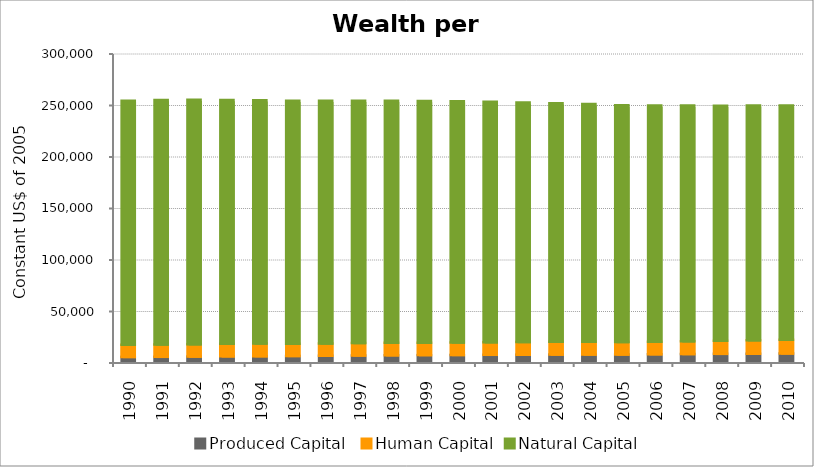
| Category | Produced Capital  | Human Capital | Natural Capital |
|---|---|---|---|
| 1990.0 | 4715 | 11854.096 | 236830.702 |
| 1991.0 | 4791.001 | 11918.609 | 237310.355 |
| 1992.0 | 5017.584 | 12013.567 | 237249.143 |
| 1993.0 | 5246.571 | 12131.529 | 236819.996 |
| 1994.0 | 5440.99 | 12242.044 | 236279.075 |
| 1995.0 | 5647.269 | 11907.553 | 235810.443 |
| 1996.0 | 5865.684 | 11973.39 | 235476.738 |
| 1997.0 | 6107.911 | 12037.952 | 235227.105 |
| 1998.0 | 6302.938 | 12082.219 | 234990.758 |
| 1999.0 | 6467.128 | 12095.953 | 234650.968 |
| 2000.0 | 6613.131 | 12080.127 | 234130.033 |
| 2001.0 | 6755.822 | 12239.35 | 233415.895 |
| 2002.0 | 6886.099 | 12344.537 | 232562.644 |
| 2003.0 | 6969.808 | 12399.725 | 231643.453 |
| 2004.0 | 7028.036 | 12440.09 | 230761.863 |
| 2005.0 | 7081.8 | 12037.899 | 229986.79 |
| 2006.0 | 7303.784 | 12199.293 | 229341.803 |
| 2007.0 | 7481.91 | 12391.071 | 228801.764 |
| 2008.0 | 7649.065 | 12629.972 | 228336.608 |
| 2009.0 | 7880.707 | 12898.841 | 227897.598 |
| 2010.0 | 8102.547 | 13180.24 | 227447.739 |